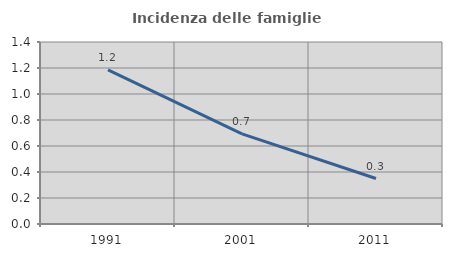
| Category | Incidenza delle famiglie numerose |
|---|---|
| 1991.0 | 1.185 |
| 2001.0 | 0.693 |
| 2011.0 | 0.35 |